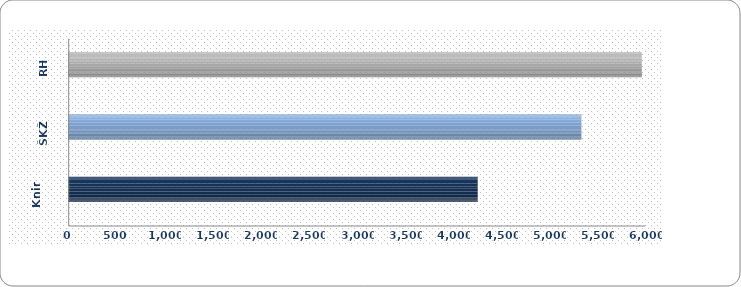
| Category | Series 0 |
|---|---|
| Knin | 4263 |
| ŠKŽ | 5342 |
| RH | 5971 |